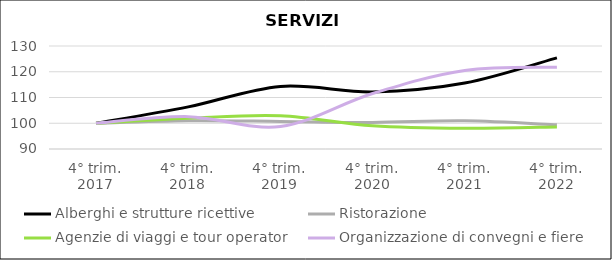
| Category | Alberghi e strutture ricettive | Ristorazione | Agenzie di viaggi e tour operator | Organizzazione di convegni e fiere |
|---|---|---|---|---|
| 4° trim.
2017 | 100 | 100 | 100 | 100 |
| 4° trim.
2018 | 106.349 | 100.987 | 101.951 | 102.564 |
| 4° trim.
2019 | 114.286 | 100.713 | 102.927 | 98.718 |
| 4° trim.
2020 | 112.169 | 100.311 | 99.024 | 111.538 |
| 4° trim.
2021 | 115.608 | 100.933 | 98.049 | 120.513 |
| 4° trim.
2022 | 125.397 | 99.378 | 98.537 | 121.795 |